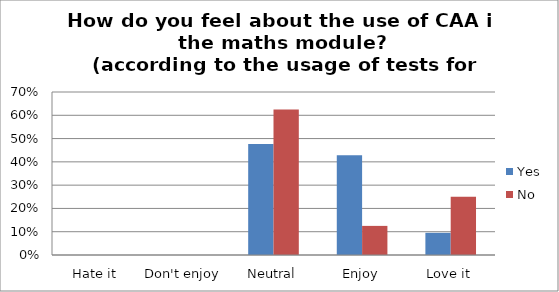
| Category | Yes | No |
|---|---|---|
| Hate it | 0 | 0 |
| Don't enjoy | 0 | 0 |
| Neutral | 0.476 | 0.625 |
| Enjoy | 0.429 | 0.125 |
| Love it | 0.095 | 0.25 |